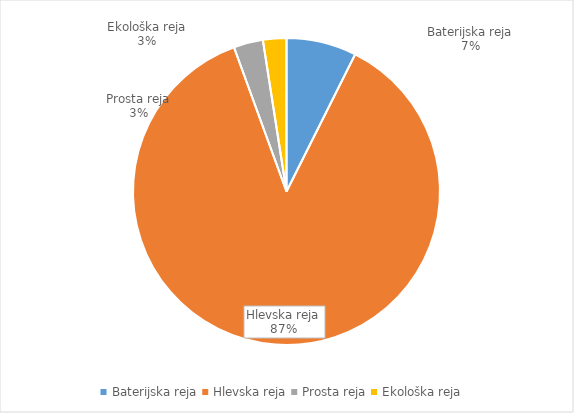
| Category | Količina kosov jajc |
|---|---|
| Baterijska reja | 231330 |
| Hlevska reja | 2726624 |
| Prosta reja | 96851 |
| Ekološka reja | 77240 |